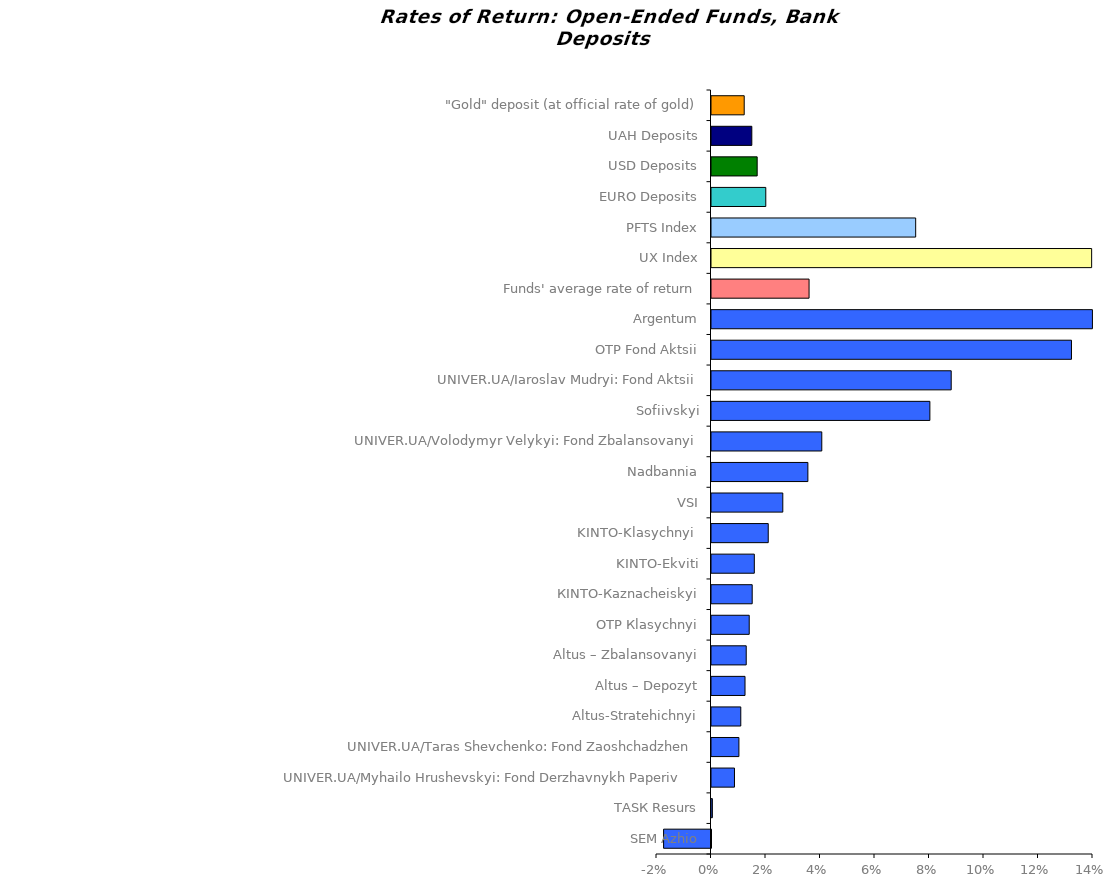
| Category | Series 0 |
|---|---|
| SEM Azhio | -0.017 |
| ТАSК Resurs | 0 |
| UNIVER.UA/Myhailo Hrushevskyi: Fond Derzhavnykh Paperiv    | 0.008 |
| UNIVER.UA/Taras Shevchenko: Fond Zaoshchadzhen | 0.01 |
| Altus-Stratehichnyi | 0.011 |
| Altus – Depozyt | 0.012 |
| Altus – Zbalansovanyi | 0.013 |
| ОТP Кlasychnyi | 0.014 |
| КІNTO-Каznacheiskyi | 0.015 |
| KINTO-Ekviti | 0.016 |
| KINTO-Klasychnyi  | 0.021 |
| VSI | 0.026 |
| Nadbannia | 0.035 |
| UNIVER.UA/Volodymyr Velykyi: Fond Zbalansovanyi | 0.04 |
| Sofiivskyi | 0.08 |
| UNIVER.UA/Iaroslav Mudryi: Fond Aktsii | 0.088 |
| ОТP Fond Aktsii | 0.132 |
| Аrgentum | 0.14 |
| Funds' average rate of return | 0.036 |
| UX Index | 0.14 |
| PFTS Index | 0.075 |
| EURO Deposits | 0.02 |
| USD Deposits | 0.017 |
| UAH Deposits | 0.015 |
| "Gold" deposit (at official rate of gold) | 0.012 |